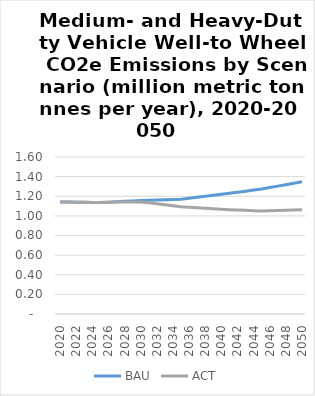
| Category | BAU | ACT |
|---|---|---|
| 2020.0 | 1.143 | 1.143 |
| 2021.0 | 1.141 | 1.141 |
| 2022.0 | 1.14 | 1.14 |
| 2023.0 | 1.139 | 1.139 |
| 2024.0 | 1.137 | 1.137 |
| 2025.0 | 1.136 | 1.136 |
| 2026.0 | 1.14 | 1.14 |
| 2027.0 | 1.144 | 1.141 |
| 2028.0 | 1.148 | 1.141 |
| 2029.0 | 1.152 | 1.142 |
| 2030.0 | 1.156 | 1.142 |
| 2031.0 | 1.159 | 1.133 |
| 2032.0 | 1.161 | 1.123 |
| 2033.0 | 1.164 | 1.113 |
| 2034.0 | 1.167 | 1.104 |
| 2035.0 | 1.17 | 1.094 |
| 2036.0 | 1.18 | 1.089 |
| 2037.0 | 1.19 | 1.083 |
| 2038.0 | 1.2 | 1.078 |
| 2039.0 | 1.21 | 1.072 |
| 2040.0 | 1.22 | 1.067 |
| 2041.0 | 1.231 | 1.064 |
| 2042.0 | 1.241 | 1.06 |
| 2043.0 | 1.252 | 1.057 |
| 2044.0 | 1.263 | 1.053 |
| 2045.0 | 1.273 | 1.05 |
| 2046.0 | 1.288 | 1.053 |
| 2047.0 | 1.303 | 1.055 |
| 2048.0 | 1.318 | 1.058 |
| 2049.0 | 1.333 | 1.061 |
| 2050.0 | 1.348 | 1.063 |